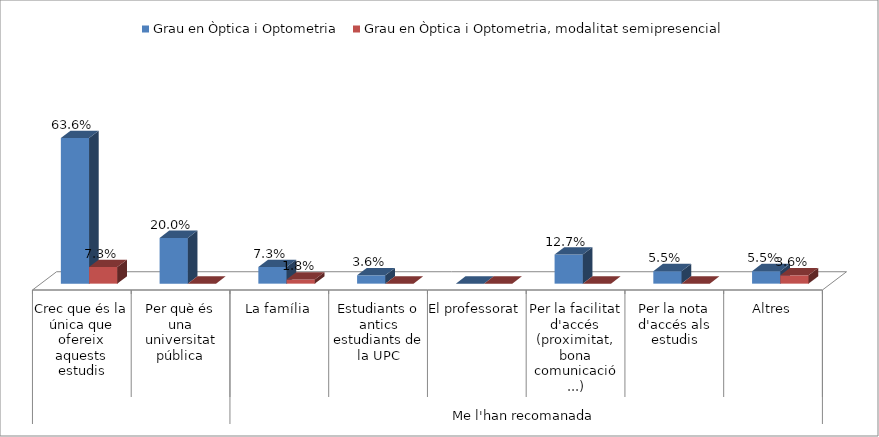
| Category | Grau en Òptica i Optometria | Grau en Òptica i Optometria, modalitat semipresencial |
|---|---|---|
| 0 | 0.636 | 0.073 |
| 1 | 0.2 | 0 |
| 2 | 0.073 | 0.018 |
| 3 | 0.036 | 0 |
| 4 | 0 | 0 |
| 5 | 0.127 | 0 |
| 6 | 0.055 | 0 |
| 7 | 0.055 | 0.036 |